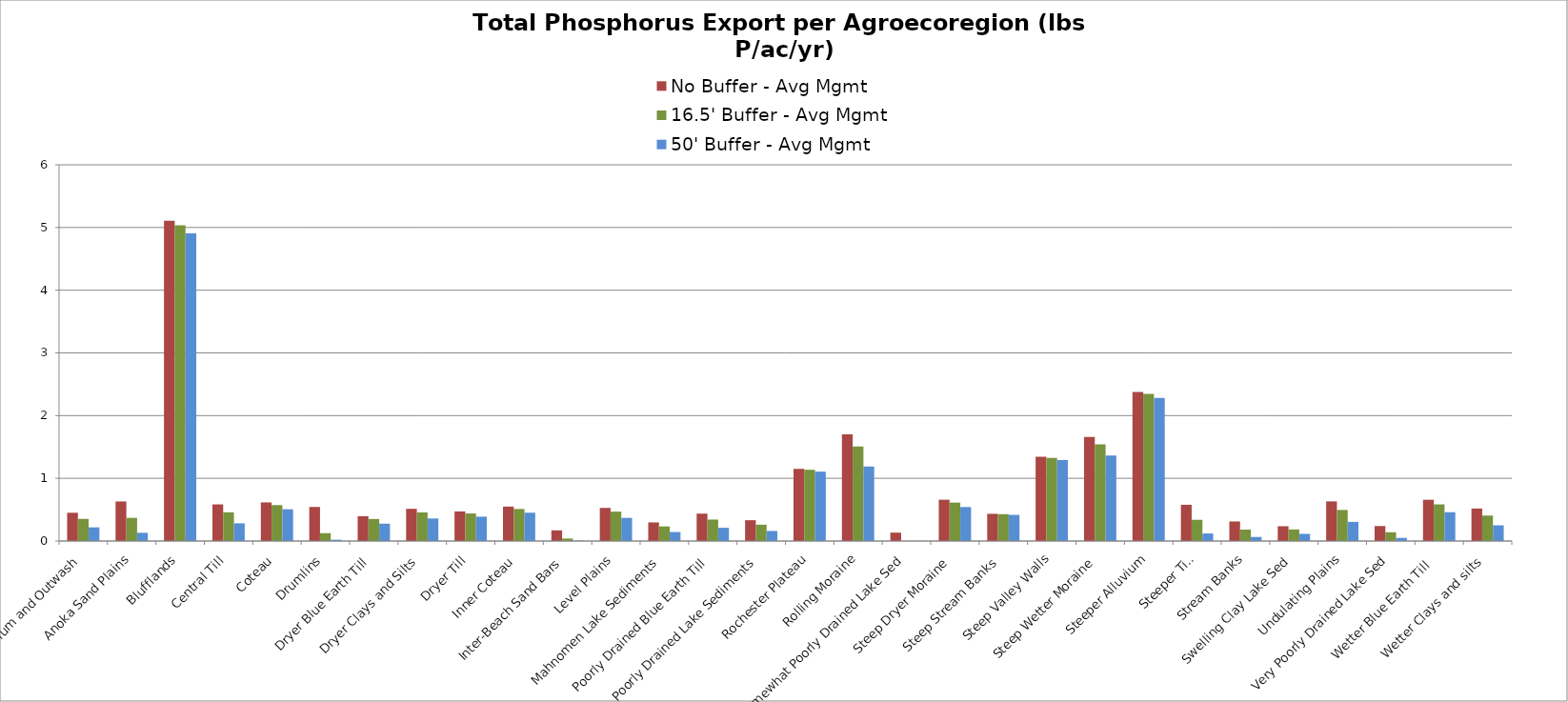
| Category | No Buffer - Avg Mgmt | 16.5' Buffer - Avg Mgmt | 50' Buffer - Avg Mgmt |
|---|---|---|---|
| Alluvium and Outwash | 0.451 | 0.353 | 0.218 |
| Anoka Sand Plains | 0.631 | 0.37 | 0.131 |
| Blufflands | 5.107 | 5.036 | 4.905 |
| Central Till | 0.584 | 0.458 | 0.282 |
| Coteau | 0.616 | 0.573 | 0.507 |
| Drumlins | 0.543 | 0.125 | 0.021 |
| Dryer Blue Earth Till | 0.396 | 0.352 | 0.277 |
| Dryer Clays and Silts | 0.514 | 0.456 | 0.359 |
| Dryer Till | 0.472 | 0.439 | 0.388 |
| Inner Coteau | 0.549 | 0.511 | 0.452 |
| Inter-Beach Sand Bars | 0.17 | 0.039 | 0.006 |
| Level Plains | 0.528 | 0.469 | 0.369 |
| Mahnomen Lake Sediments | 0.297 | 0.233 | 0.144 |
| Poorly Drained Blue Earth Till | 0.437 | 0.342 | 0.211 |
| Poorly Drained Lake Sediments | 0.332 | 0.26 | 0.16 |
| Rochester Plateau | 1.152 | 1.136 | 1.107 |
| Rolling Moraine | 1.7 | 1.509 | 1.188 |
| Somewhat Poorly Drained Lake Sed | 0.134 | 0 | 0 |
| Steep Dryer Moraine | 0.659 | 0.613 | 0.542 |
| Steep Stream Banks | 0.434 | 0.428 | 0.417 |
| Steep Valley Walls | 1.344 | 1.325 | 1.291 |
| Steep Wetter Moraine | 1.659 | 1.543 | 1.365 |
| Steeper Alluvium | 2.378 | 2.345 | 2.284 |
| Steeper Till | 0.578 | 0.338 | 0.12 |
| Stream Banks | 0.312 | 0.183 | 0.065 |
| Swelling Clay Lake Sed | 0.236 | 0.185 | 0.114 |
| Undulating Plains | 0.632 | 0.495 | 0.305 |
| Very Poorly Drained Lake Sed | 0.239 | 0.14 | 0.05 |
| Wetter Blue Earth Till  | 0.658 | 0.584 | 0.46 |
| Wetter Clays and silts | 0.518 | 0.406 | 0.25 |